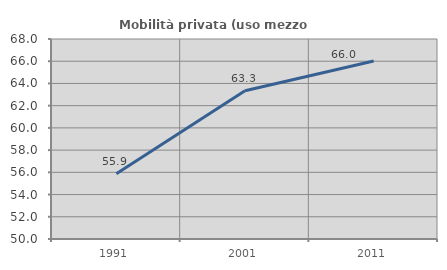
| Category | Mobilità privata (uso mezzo privato) |
|---|---|
| 1991.0 | 55.872 |
| 2001.0 | 63.339 |
| 2011.0 | 66.018 |